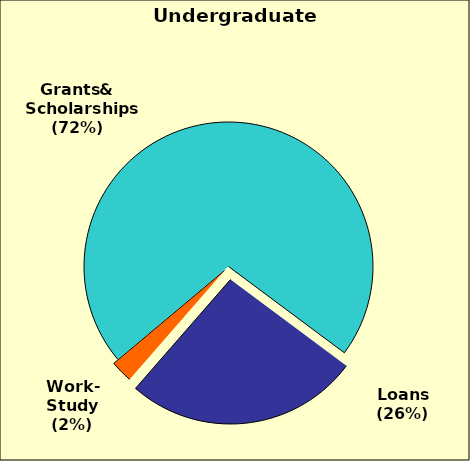
| Category | Series 0 |
|---|---|
| 0 | 0.713 |
| 1 | 0.262 |
| 2 | 0.025 |